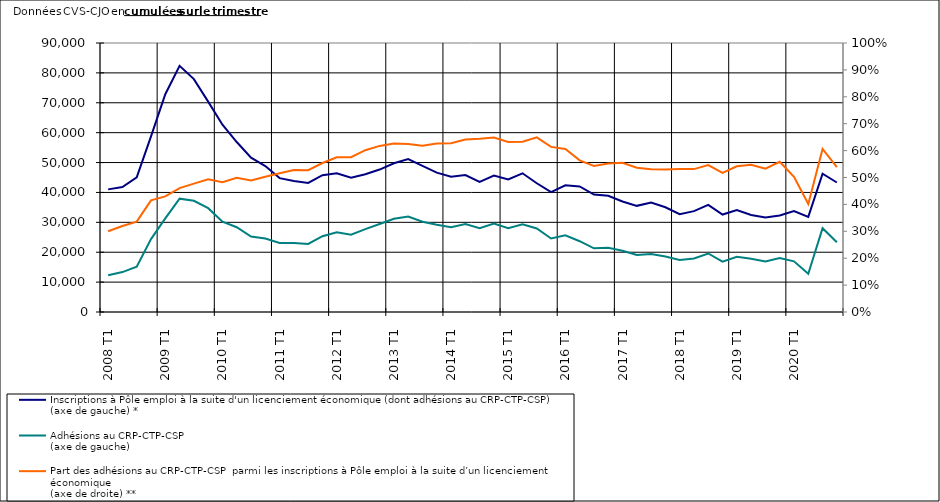
| Category | Inscriptions à Pôle emploi à la suite d'un licenciement économique (dont adhésions au CRP-CTP-CSP) 
(axe de gauche) * | Adhésions au CRP-CTP-CSP 
(axe de gauche) |
|---|---|---|
| 2008 T1 | 41024 | 12313 |
| 2008 T2 | 41814 | 13361 |
| 2008 T3 | 45060 | 15139 |
| 2008 T4 | 58759 | 24378 |
| 2009 T1 | 72864 | 31303 |
| 2009 T2 | 82369 | 37918 |
| 2009 T3 | 77923 | 37193 |
| 2009 T4 | 70390 | 34745 |
| 2010 T1 | 62656 | 30229 |
| 2010 T2 | 56873 | 28359 |
| 2010 T3 | 51623 | 25230 |
| 2010 T4 | 48843 | 24559 |
| 2011 T1 | 44787 | 23098 |
| 2011 T2 | 43807 | 23111 |
| 2011 T3 | 43192 | 22761 |
| 2011 T4 | 45782 | 25355 |
| 2012 T1 | 46417 | 26687 |
| 2012 T2 | 44898 | 25831 |
| 2012 T3 | 46102 | 27726 |
| 2012 T4 | 47655 | 29423 |
| 2013 T1 | 49757 | 31174 |
| 2013 T2 | 51145 | 31961 |
| 2013 T3 | 48886 | 30200 |
| 2013 T4 | 46620 | 29220 |
| 2014 T1 | 45228 | 28379 |
| 2014 T2 | 45843 | 29407 |
| 2014 T3 | 43554 | 28069 |
| 2014 T4 | 45627 | 29610 |
| 2015 T1 | 44361 | 28052 |
| 2015 T2 | 46410 | 29362 |
| 2015 T3 | 43076 | 27964 |
| 2015 T4 | 40082 | 24598 |
| 2016 T1 | 42386 | 25680 |
| 2016 T2 | 42005 | 23683 |
| 2016 T3 | 39275 | 21317 |
| 2016 T4 | 38893 | 21462 |
| 2017 T1 | 36957 | 20508 |
| 2017 T2 | 35517 | 19045 |
| 2017 T3 | 36606 | 19439 |
| 2017 T4 | 35041 | 18578 |
| 2018 T1 | 32711 | 17391 |
| 2018 T2 | 33742 | 17922 |
| 2018 T3 | 35854 | 19581 |
| 2018 T4 | 32604 | 16860 |
| 2019 T1 | 34073 | 18455 |
| 2019 T2 | 32482 | 17788 |
| 2019 T3 | 31644 | 16865 |
| 2019 T4 | 32299 | 18035 |
| 2020 T1 | 33768 | 16964 |
| 2020 T2 | 31810 | 12780 |
| 2020 T3 | 46279 | 28042 |
| 2020 T4 | 43325 | 23323 |